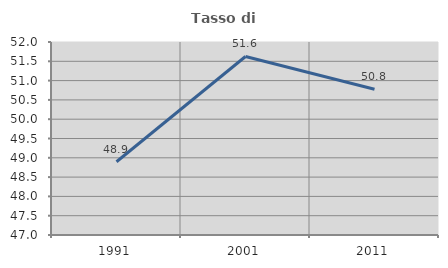
| Category | Tasso di occupazione   |
|---|---|
| 1991.0 | 48.898 |
| 2001.0 | 51.625 |
| 2011.0 | 50.778 |